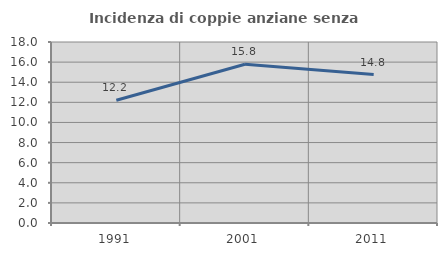
| Category | Incidenza di coppie anziane senza figli  |
|---|---|
| 1991.0 | 12.201 |
| 2001.0 | 15.783 |
| 2011.0 | 14.765 |